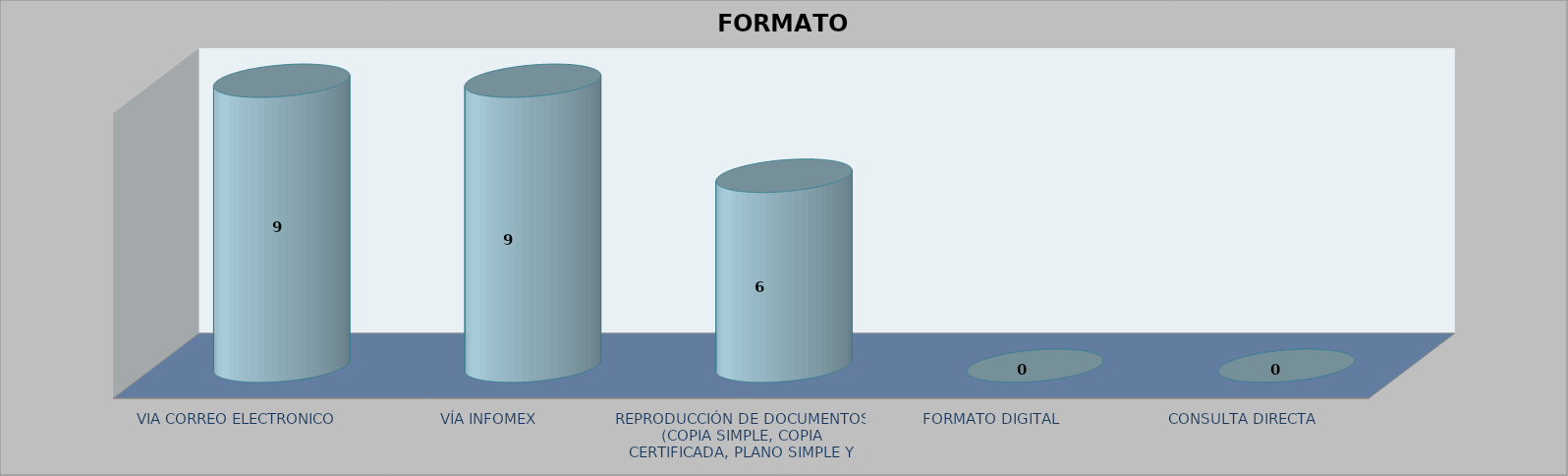
| Category |        FORMATO SOLICITADO | Series 1 | Series 2 |
|---|---|---|---|
| VIA CORREO ELECTRONICO |  |  | 9 |
| VÍA INFOMEX |  |  | 9 |
| REPRODUCCIÓN DE DOCUMENTOS (COPIA SIMPLE, COPIA CERTIFICADA, PLANO SIMPLE Y PLANO CERTIFICADO) |  |  | 6 |
| FORMATO DIGITAL |  |  | 0 |
| CONSULTA DIRECTA |  |  | 0 |